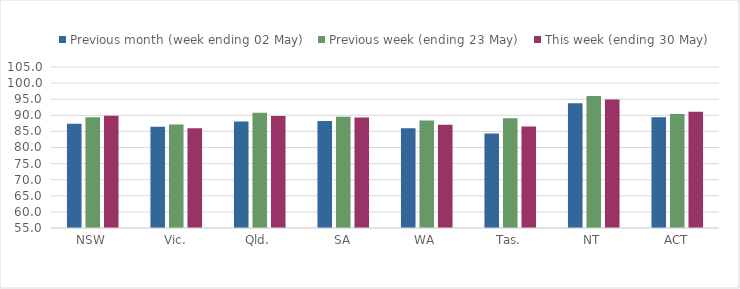
| Category | Previous month (week ending 02 May) | Previous week (ending 23 May) | This week (ending 30 May) |
|---|---|---|---|
| NSW | 87.357 | 89.41 | 89.866 |
| Vic. | 86.479 | 87.156 | 86.007 |
| Qld. | 88.108 | 90.803 | 89.773 |
| SA | 88.206 | 89.531 | 89.328 |
| WA | 85.943 | 88.402 | 87.081 |
| Tas. | 84.333 | 89.063 | 86.497 |
| NT | 93.764 | 96.016 | 94.888 |
| ACT | 89.357 | 90.424 | 91.094 |